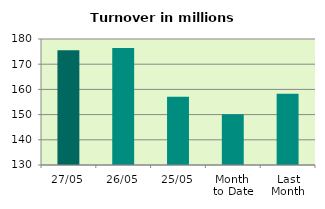
| Category | Series 0 |
|---|---|
| 27/05 | 175.532 |
| 26/05 | 176.399 |
| 25/05 | 157.109 |
| Month 
to Date | 150.184 |
| Last
Month | 158.303 |